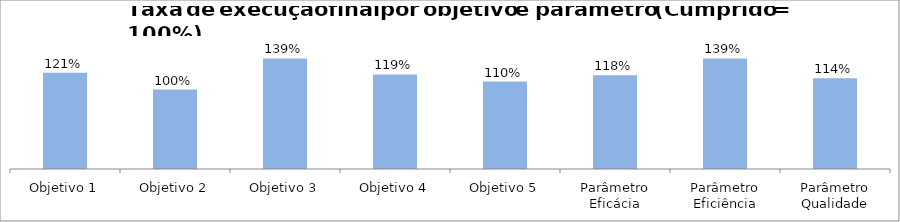
| Category | Series 0 |
|---|---|
| Objetivo 1 | 1.21 |
| Objetivo 2 | 1 |
| Objetivo 3 | 1.39 |
| Objetivo 4 | 1.19 |
| Objetivo 5 | 1.1 |
| Parâmetro Eficácia | 1.18 |
| Parâmetro Eficiência | 1.39 |
| Parâmetro Qualidade | 1.14 |